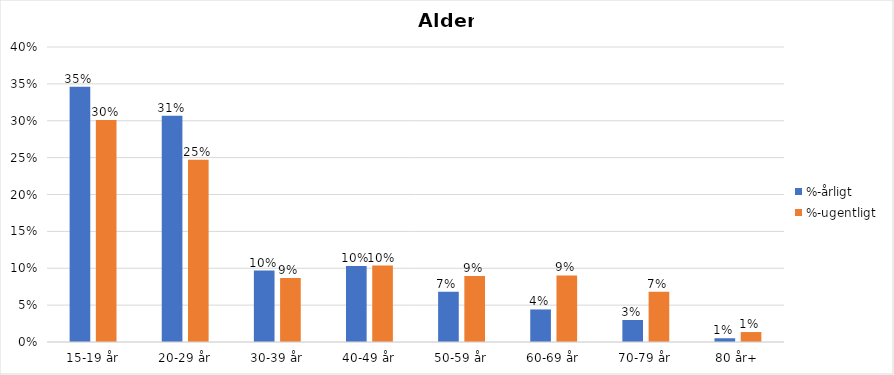
| Category | %-årligt | %-ugentligt |
|---|---|---|
| 15-19 år | 0.346 | 0.301 |
| 20-29 år | 0.307 | 0.247 |
| 30-39 år | 0.097 | 0.087 |
| 40-49 år | 0.103 | 0.104 |
| 50-59 år | 0.068 | 0.089 |
| 60-69 år | 0.044 | 0.09 |
| 70-79 år | 0.03 | 0.068 |
| 80 år+ | 0.005 | 0.013 |